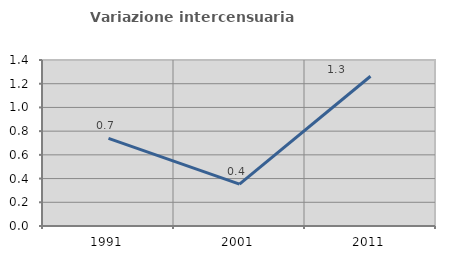
| Category | Variazione intercensuaria annua |
|---|---|
| 1991.0 | 0.74 |
| 2001.0 | 0.353 |
| 2011.0 | 1.263 |